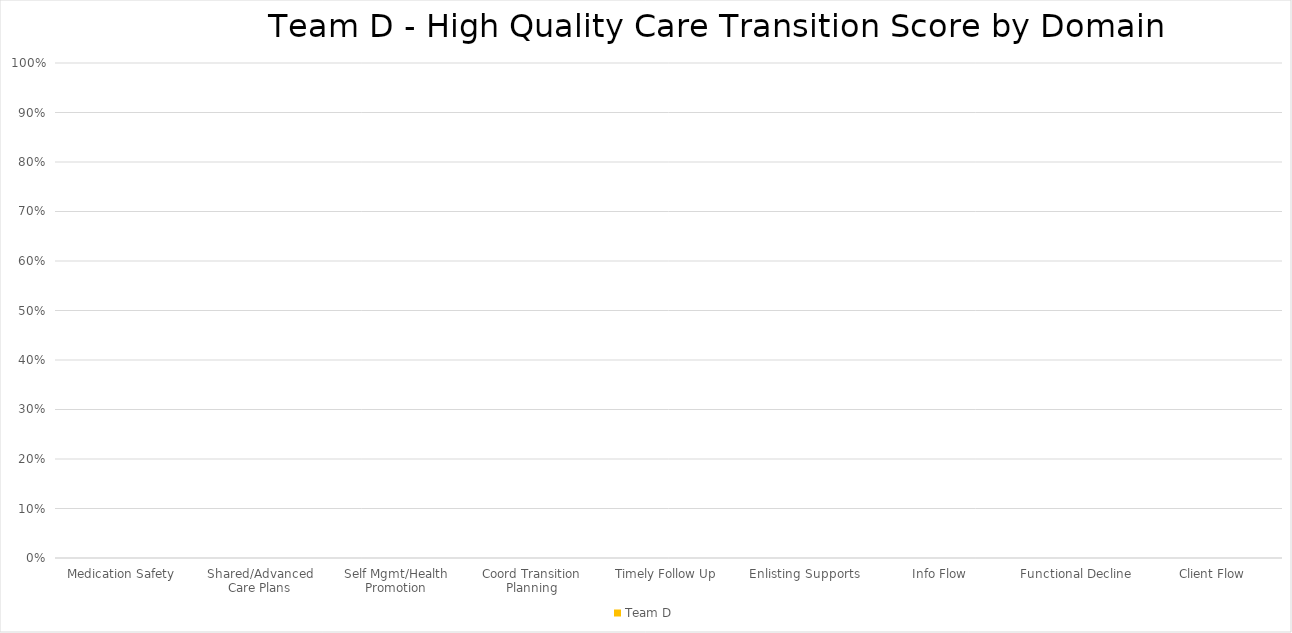
| Category | Team D |
|---|---|
| Medication Safety | 0 |
| Shared/Advanced Care Plans | 0 |
| Self Mgmt/Health Promotion | 0 |
| Coord Transition Planning | 0 |
| Timely Follow Up | 0 |
| Enlisting Supports | 0 |
| Info Flow | 0 |
| Functional Decline | 0 |
| Client Flow | 0 |